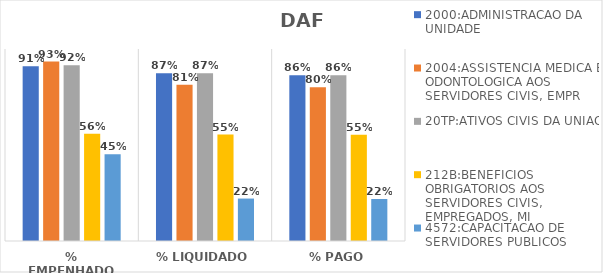
| Category | 2000:ADMINISTRACAO DA UNIDADE | 2004:ASSISTENCIA MEDICA E ODONTOLOGICA AOS SERVIDORES CIVIS, EMPR | 20TP:ATIVOS CIVIS DA UNIAO | 212B:BENEFICIOS OBRIGATORIOS AOS SERVIDORES CIVIS, EMPREGADOS, MI | 4572:CAPACITACAO DE SERVIDORES PUBLICOS FEDERAIS EM PROCESSO DE Q |
|---|---|---|---|---|---|
| % EMPENHADO | 0.91 | 0.935 | 0.915 | 0.558 | 0.452 |
| % LIQUIDADO | 0.874 | 0.814 | 0.873 | 0.554 | 0.221 |
| % PAGO | 0.863 | 0.8 | 0.864 | 0.554 | 0.219 |